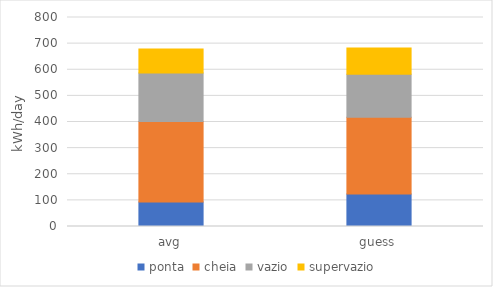
| Category | ponta | cheia | vazio | supervazio |
|---|---|---|---|---|
| avg | 93.981 | 307.707 | 185.572 | 92.383 |
| guess | 124 | 294 | 165 | 100 |